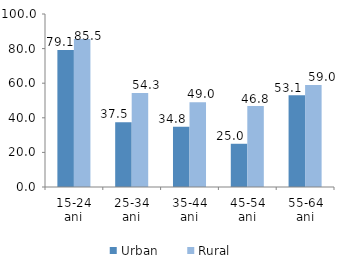
| Category | Urban | Rural |
|---|---|---|
| 15-24 ani | 79.137 | 85.533 |
| 25-34 ani | 37.469 | 54.322 |
| 35-44 ani | 34.799 | 48.979 |
| 45-54 ani | 24.988 | 46.791 |
| 55-64 ani | 53.106 | 59.014 |